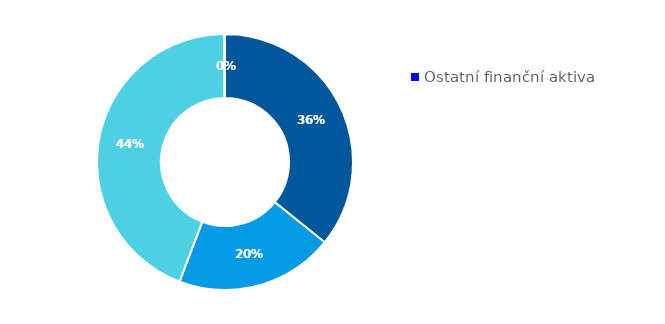
| Category | Series 0 |
|---|---|
| Hotovost | 0.358 |
| Půjčky poskytnuté nemovitostní společnosti | 0.2 |
| Majetkové účasti v nemovitostní společnosti | 0.441 |
| Ostatní finanční aktiva | 0.001 |